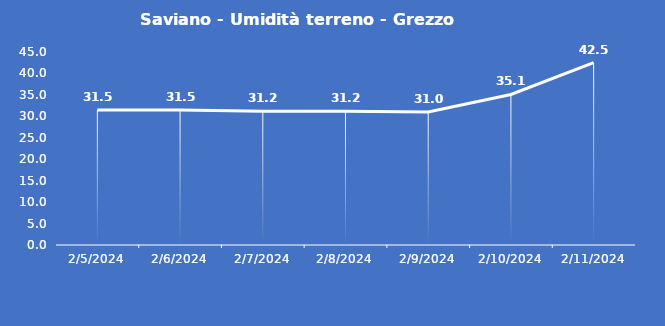
| Category | Saviano - Umidità terreno - Grezzo (%VWC) |
|---|---|
| 2/5/24 | 31.5 |
| 2/6/24 | 31.5 |
| 2/7/24 | 31.2 |
| 2/8/24 | 31.2 |
| 2/9/24 | 31 |
| 2/10/24 | 35.1 |
| 2/11/24 | 42.5 |